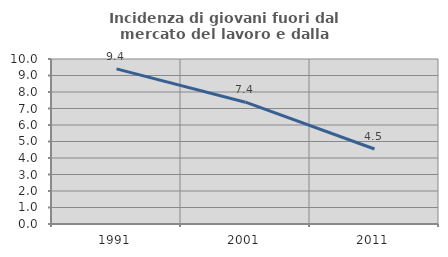
| Category | Incidenza di giovani fuori dal mercato del lavoro e dalla formazione  |
|---|---|
| 1991.0 | 9.404 |
| 2001.0 | 7.383 |
| 2011.0 | 4.545 |